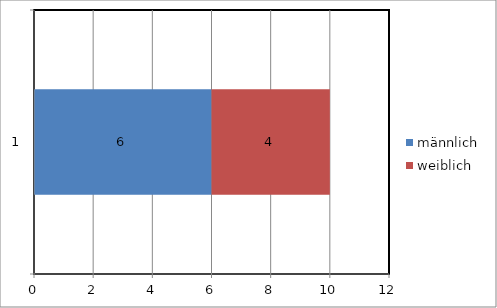
| Category | männlich | weiblich |
|---|---|---|
| 0 | 6 | 4 |